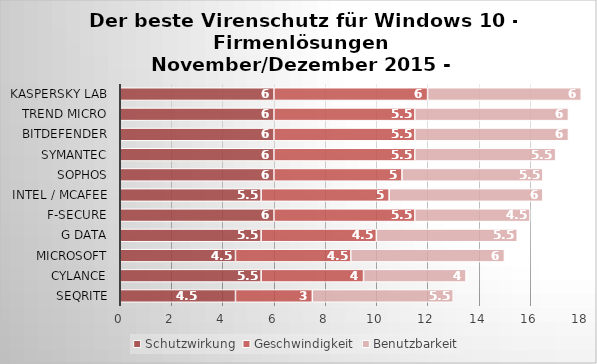
| Category | Schutzwirkung | Geschwindigkeit | Benutzbarkeit |
|---|---|---|---|
| Seqrite | 4.5 | 3 | 5.5 |
| Cylance | 5.5 | 4 | 4 |
| Microsoft | 4.5 | 4.5 | 6 |
| G Data | 5.5 | 4.5 | 5.5 |
| F-Secure | 6 | 5.5 | 4.5 |
| Intel / McAfee | 5.5 | 5 | 6 |
| Sophos | 6 | 5 | 5.5 |
| Symantec | 6 | 5.5 | 5.5 |
| Bitdefender | 6 | 5.5 | 6 |
| Trend Micro | 6 | 5.5 | 6 |
| Kaspersky Lab | 6 | 6 | 6 |